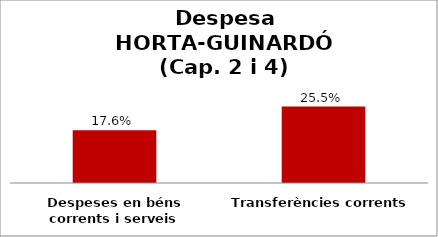
| Category | Series 0 |
|---|---|
| Despeses en béns corrents i serveis | 0.176 |
| Transferències corrents | 0.255 |